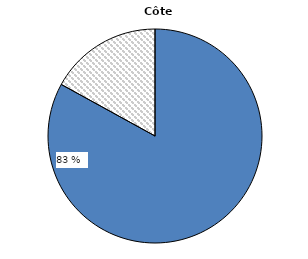
| Category | Côte d'Ivoire |
|---|---|
|   Sans contrat de travail formel | 83 |
| Avec un contrat de travail formel | 17 |